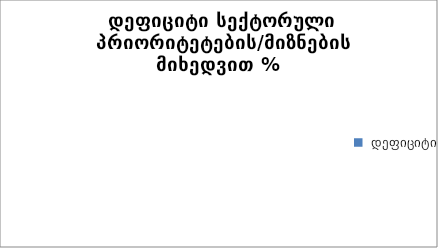
| Category | სექტორული პრიორიტეტი/მიზანი 1 | სექტორული პრიორიტეტი/მიზანი 2 | #REF! | სულ |
|---|---|---|---|---|
|  დეფიციტი  |  |  | 1 | 0 |